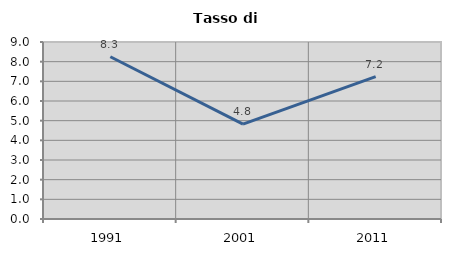
| Category | Tasso di disoccupazione   |
|---|---|
| 1991.0 | 8.25 |
| 2001.0 | 4.82 |
| 2011.0 | 7.241 |